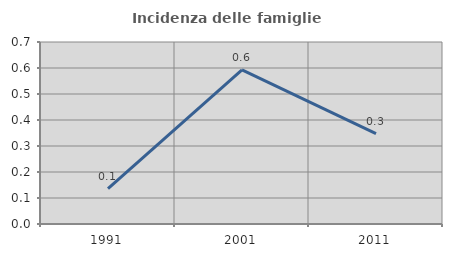
| Category | Incidenza delle famiglie numerose |
|---|---|
| 1991.0 | 0.136 |
| 2001.0 | 0.592 |
| 2011.0 | 0.347 |